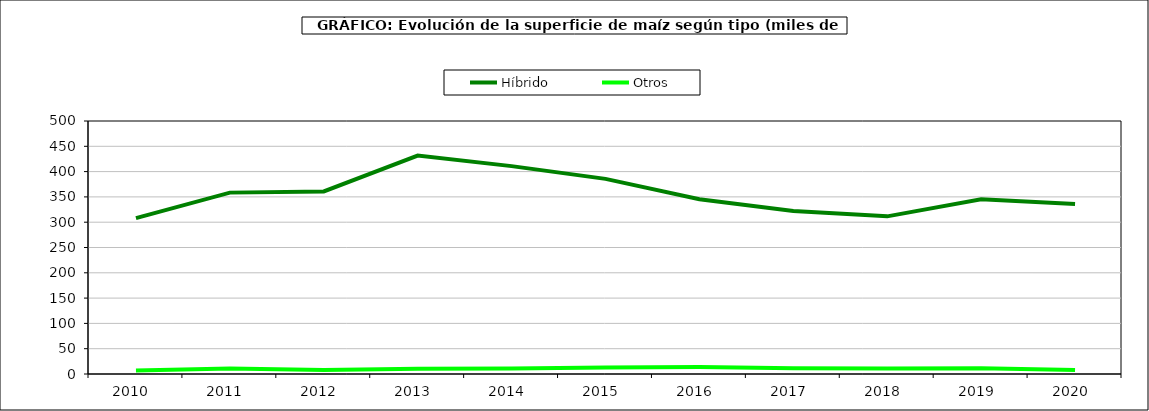
| Category | Híbrido | Otros |
|---|---|---|
| 2010.0 | 307.927 | 7.063 |
| 2011.0 | 358.45 | 10.814 |
| 2012.0 | 360.837 | 7.917 |
| 2013.0 | 431.742 | 10.556 |
| 2014.0 | 410.83 | 10.775 |
| 2015.0 | 385.617 | 12.64 |
| 2016.0 | 345.266 | 14.009 |
| 2017.0 | 322.341 | 11.287 |
| 2018.0 | 311.54 | 10.833 |
| 2019.0 | 345.448 | 11.377 |
| 2020.0 | 336.099 | 7.679 |